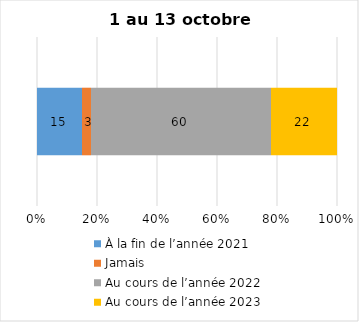
| Category | À la fin de l’année 2021 | Jamais | Au cours de l’année 2022 | Au cours de l’année 2023 |
|---|---|---|---|---|
| 0 | 15 | 3 | 60 | 22 |